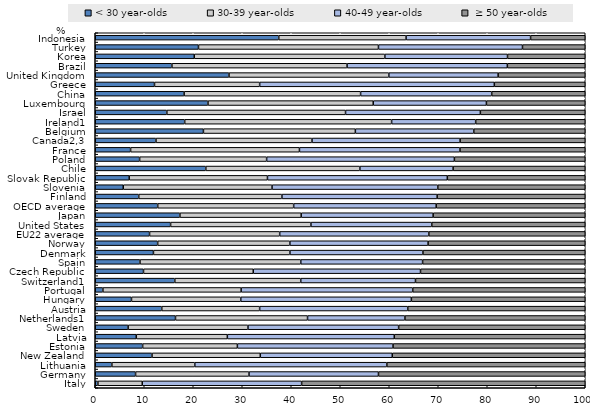
| Category | < 30 year-olds | 30-39 year-olds | 40-49 year-olds |  ≥ 50 year-olds |
|---|---|---|---|---|
| Italy | 0.541 | 9.049 | 32.529 | 57.881 |
| Germany | 8.23 | 23.151 | 26.416 | 42.203 |
| Lithuania | 3.392 | 16.925 | 39.195 | 40.488 |
| New Zealand | 11.588 | 22.095 | 26.935 | 39.382 |
| Estonia | 9.674 | 19.332 | 31.768 | 39.226 |
| Latvia | 8.377 | 18.582 | 34.068 | 38.973 |
| Sweden | 6.712 | 24.455 | 30.747 | 38.086 |
| Netherlands1 | 16.376 | 26.948 | 19.876 | 36.8 |
| Austria | 13.578 | 19.973 | 30.227 | 36.222 |
| Hungary | 7.395 | 22.303 | 34.819 | 35.483 |
| Portugal | 1.559 | 28.212 | 35.019 | 35.21 |
| Switzerland1 | 16.235 | 25.703 | 23.417 | 34.645 |
| Czech Republic | 9.848 | 22.399 | 34.131 | 33.622 |
| Spain | 9.13 | 32.814 | 24.864 | 33.192 |
| Denmark | 11.877 | 27.852 | 27.147 | 33.124 |
| Norway | 12.737 | 26.985 | 28.203 | 32.076 |
| EU22 average | 11.083 | 26.559 | 30.433 | 31.926 |
| United States | 15.376 | 28.639 | 24.659 | 31.326 |
| Japan | 17.281 | 24.747 | 26.928 | 31.044 |
| OECD average | 12.746 | 27.745 | 29.089 | 30.419 |
| Finland | 8.876 | 29.221 | 31.681 | 30.222 |
| Slovenia | 5.716 | 30.363 | 33.828 | 30.093 |
| Slovak Republic | 6.928 | 28.218 | 36.707 | 28.147 |
| Chile | 22.57 | 31.437 | 19.028 | 26.965 |
| Poland | 9.056 | 25.92 | 38.319 | 26.705 |
| France | 7.215 | 34.459 | 32.76 | 25.567 |
| Canada2,3 | 12.392 | 31.844 | 30.227 | 25.536 |
| Belgium | 22.079 | 31.006 | 24.165 | 22.75 |
| Ireland1 | 18.253 | 42.229 | 17.156 | 22.362 |
| Israel | 14.613 | 36.467 | 27.515 | 21.404 |
| Luxembourg | 23.006 | 33.725 | 23.098 | 20.171 |
| China | 18.141 | 36.013 | 26.756 | 19.09 |
| Greece | 12.093 | 21.462 | 47.891 | 18.554 |
| United Kingdom | 27.299 | 32.616 | 22.306 | 17.779 |
| Brazil | 15.645 | 35.747 | 32.712 | 15.897 |
| Korea | 20.209 | 38.896 | 25.029 | 15.866 |
| Turkey | 21.066 | 36.732 | 29.395 | 12.807 |
| Indonesia | 37.451 | 25.986 | 25.406 | 11.157 |